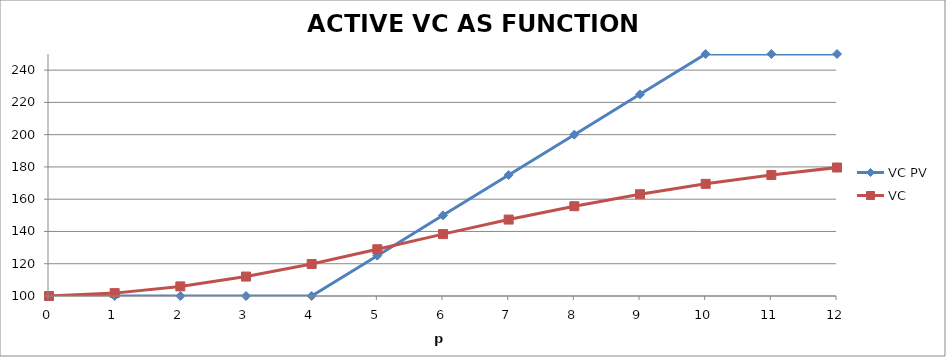
| Category | VC PV | VC  |
|---|---|---|
| 0.0 | 100 | 100 |
| 1.0 | 100 | 101.786 |
| 2.0 | 100 | 105.954 |
| 3.0 | 100 | 112.041 |
| 4.0 | 100 | 119.846 |
| 5.0 | 125 | 128.976 |
| 6.0 | 150 | 138.369 |
| 7.0 | 175 | 147.373 |
| 8.0 | 200 | 155.668 |
| 9.0 | 225 | 163.081 |
| 10.0 | 250 | 169.52 |
| 11.0 | 250 | 174.979 |
| 12.0 | 250 | 179.638 |